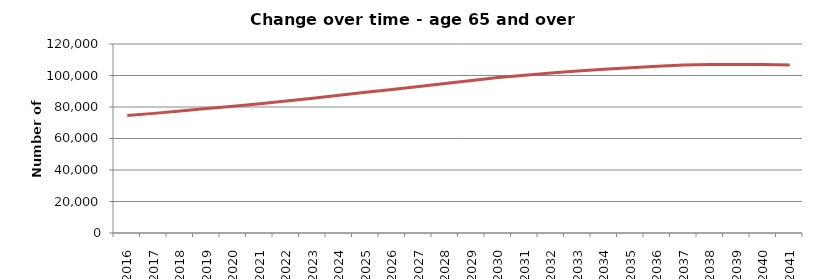
| Category | Northumberland |
|---|---|
| 2016.0 | 74529 |
| 2017.0 | 75954.689 |
| 2018.0 | 77454.444 |
| 2019.0 | 79031.619 |
| 2020.0 | 80479.321 |
| 2021.0 | 82095.204 |
| 2022.0 | 83737.091 |
| 2023.0 | 85574.471 |
| 2024.0 | 87487.033 |
| 2025.0 | 89358.898 |
| 2026.0 | 91155.335 |
| 2027.0 | 93018.539 |
| 2028.0 | 94897.183 |
| 2029.0 | 96822.688 |
| 2030.0 | 98703.74 |
| 2031.0 | 100217.02 |
| 2032.0 | 101658.163 |
| 2033.0 | 102882.977 |
| 2034.0 | 103961.32 |
| 2035.0 | 104851.025 |
| 2036.0 | 105924.7 |
| 2037.0 | 106596.015 |
| 2038.0 | 106923.77 |
| 2039.0 | 106973.202 |
| 2040.0 | 106914.242 |
| 2041.0 | 106715.588 |